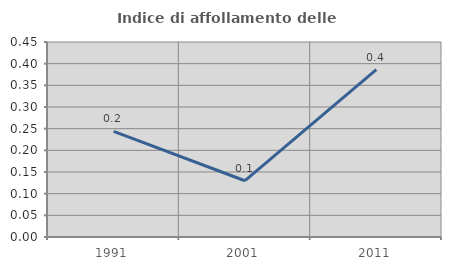
| Category | Indice di affollamento delle abitazioni  |
|---|---|
| 1991.0 | 0.244 |
| 2001.0 | 0.13 |
| 2011.0 | 0.386 |